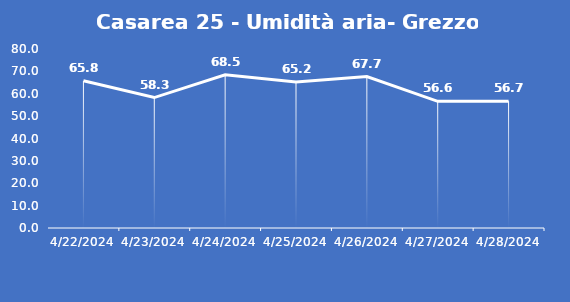
| Category | Casarea 25 - Umidità aria- Grezzo (%) |
|---|---|
| 4/22/24 | 65.8 |
| 4/23/24 | 58.3 |
| 4/24/24 | 68.5 |
| 4/25/24 | 65.2 |
| 4/26/24 | 67.7 |
| 4/27/24 | 56.6 |
| 4/28/24 | 56.7 |